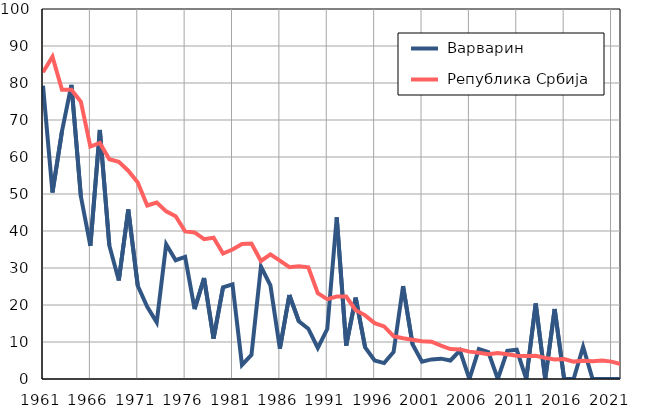
| Category |  Варварин |  Република Србија |
|---|---|---|
| 1961.0 | 79.3 | 82.9 |
| 1962.0 | 50.4 | 87.1 |
| 1963.0 | 66.9 | 78.2 |
| 1964.0 | 79.5 | 78.2 |
| 1965.0 | 49.3 | 74.9 |
| 1966.0 | 36 | 62.8 |
| 1967.0 | 67.3 | 63.8 |
| 1968.0 | 36.1 | 59.4 |
| 1969.0 | 26.6 | 58.7 |
| 1970.0 | 45.8 | 56.3 |
| 1971.0 | 25.2 | 53.1 |
| 1972.0 | 19.5 | 46.9 |
| 1973.0 | 15.3 | 47.7 |
| 1974.0 | 36.4 | 45.3 |
| 1975.0 | 32.1 | 44 |
| 1976.0 | 33 | 39.9 |
| 1977.0 | 18.9 | 39.6 |
| 1978.0 | 27.3 | 37.8 |
| 1979.0 | 10.9 | 38.2 |
| 1980.0 | 24.8 | 33.9 |
| 1981.0 | 25.6 | 35 |
| 1982.0 | 3.8 | 36.5 |
| 1983.0 | 6.5 | 36.6 |
| 1984.0 | 30.4 | 31.9 |
| 1985.0 | 25.3 | 33.7 |
| 1986.0 | 8.2 | 32 |
| 1987.0 | 22.7 | 30.2 |
| 1988.0 | 15.6 | 30.5 |
| 1989.0 | 13.6 | 30.2 |
| 1990.0 | 8.4 | 23.2 |
| 1991.0 | 13.5 | 21.6 |
| 1992.0 | 43.7 | 22.3 |
| 1993.0 | 9 | 22.3 |
| 1994.0 | 22 | 18.6 |
| 1995.0 | 8.5 | 17.2 |
| 1996.0 | 5 | 15.1 |
| 1997.0 | 4.3 | 14.2 |
| 1998.0 | 7.3 | 11.6 |
| 1999.0 | 25.1 | 11 |
| 2000.0 | 9.4 | 10.6 |
| 2001.0 | 4.7 | 10.2 |
| 2002.0 | 5.3 | 10.1 |
| 2003.0 | 5.5 | 9 |
| 2004.0 | 5 | 8.1 |
| 2005.0 | 7.7 | 8 |
| 2006.0 | 0 | 7.4 |
| 2007.0 | 8.1 | 7.1 |
| 2008.0 | 7.3 | 6.7 |
| 2009.0 | 0 | 7 |
| 2010.0 | 7.6 | 6.7 |
| 2011.0 | 7.9 | 6.3 |
| 2012.0 | 0 | 6.2 |
| 2013.0 | 20.4 | 6.3 |
| 2014.0 | 0 | 5.7 |
| 2015.0 | 18.9 | 5.3 |
| 2016.0 | 0 | 5.4 |
| 2017.0 | 0 | 4.7 |
| 2018.0 | 8.7 | 4.9 |
| 2019.0 | 0 | 4.8 |
| 2020.0 | 0 | 5 |
| 2021.0 | 0 | 4.7 |
| 2022.0 | 0 | 4 |